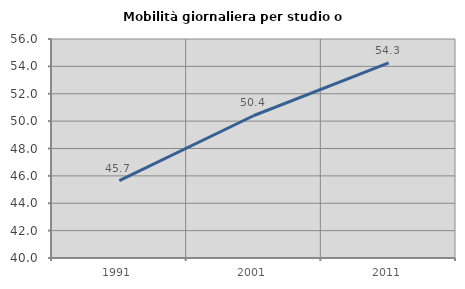
| Category | Mobilità giornaliera per studio o lavoro |
|---|---|
| 1991.0 | 45.66 |
| 2001.0 | 50.412 |
| 2011.0 | 54.25 |